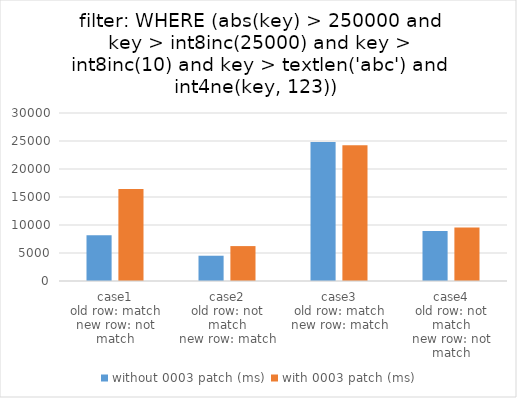
| Category | without 0003 patch (ms) | with 0003 patch (ms) |
|---|---|---|
| case1
old row: match
new row: not match | 8179.258 | 16427.018 |
| case2
old row: not match
new row: match | 4512.223 | 6233.868 |
| case3
old row: match
new row: match | 24816.001 | 24247.628 |
| case4
old row: not match
new row: not match | 8918.378 | 9557.493 |